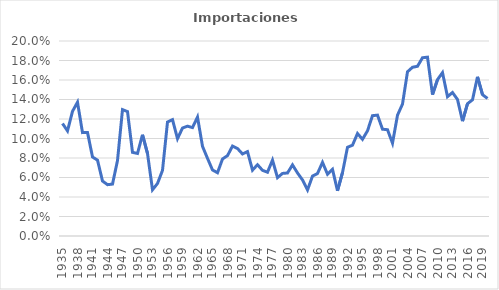
| Category | Importaciones |
|---|---|
| 1935.0 | 0.115 |
| 1936.0 | 0.108 |
| 1937.0 | 0.128 |
| 1938.0 | 0.137 |
| 1939.0 | 0.106 |
| 1940.0 | 0.106 |
| 1941.0 | 0.081 |
| 1942.0 | 0.078 |
| 1943.0 | 0.056 |
| 1944.0 | 0.053 |
| 1945.0 | 0.053 |
| 1946.0 | 0.077 |
| 1947.0 | 0.13 |
| 1948.0 | 0.128 |
| 1949.0 | 0.086 |
| 1950.0 | 0.085 |
| 1951.0 | 0.104 |
| 1952.0 | 0.085 |
| 1953.0 | 0.047 |
| 1954.0 | 0.054 |
| 1955.0 | 0.067 |
| 1956.0 | 0.117 |
| 1957.0 | 0.119 |
| 1958.0 | 0.1 |
| 1959.0 | 0.111 |
| 1960.0 | 0.113 |
| 1961.0 | 0.111 |
| 1962.0 | 0.122 |
| 1963.0 | 0.092 |
| 1964.0 | 0.08 |
| 1965.0 | 0.068 |
| 1966.0 | 0.065 |
| 1967.0 | 0.079 |
| 1968.0 | 0.082 |
| 1969.0 | 0.092 |
| 1970.0 | 0.09 |
| 1971.0 | 0.084 |
| 1972.0 | 0.087 |
| 1973.0 | 0.068 |
| 1974.0 | 0.073 |
| 1975.0 | 0.067 |
| 1976.0 | 0.065 |
| 1977.0 | 0.078 |
| 1978.0 | 0.06 |
| 1979.0 | 0.064 |
| 1980.0 | 0.065 |
| 1981.0 | 0.073 |
| 1982.0 | 0.065 |
| 1983.0 | 0.057 |
| 1984.0 | 0.047 |
| 1985.0 | 0.061 |
| 1986.0 | 0.064 |
| 1987.0 | 0.076 |
| 1988.0 | 0.063 |
| 1989.0 | 0.068 |
| 1990.0 | 0.046 |
| 1991.0 | 0.065 |
| 1992.0 | 0.091 |
| 1993.0 | 0.093 |
| 1994.0 | 0.105 |
| 1995.0 | 0.099 |
| 1996.0 | 0.108 |
| 1997.0 | 0.123 |
| 1998.0 | 0.124 |
| 1999.0 | 0.11 |
| 2000.0 | 0.109 |
| 2001.0 | 0.095 |
| 2002.0 | 0.124 |
| 2003.0 | 0.135 |
| 2004.0 | 0.168 |
| 2005.0 | 0.173 |
| 2006.0 | 0.174 |
| 2007.0 | 0.183 |
| 2008.0 | 0.183 |
| 2009.0 | 0.145 |
| 2010.0 | 0.16 |
| 2011.0 | 0.168 |
| 2012.0 | 0.143 |
| 2013.0 | 0.147 |
| 2014.0 | 0.14 |
| 2015.0 | 0.118 |
| 2016.0 | 0.136 |
| 2017.0 | 0.14 |
| 2018.0 | 0.163 |
| 2019.0 | 0.145 |
| 2020.0 | 0.141 |